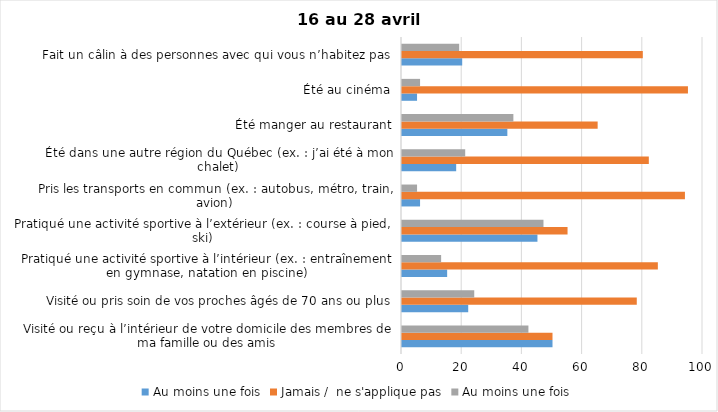
| Category | Au moins une fois | Jamais /  ne s'applique pas |
|---|---|---|
| Visité ou reçu à l’intérieur de votre domicile des membres de ma famille ou des amis | 42 | 50 |
| Visité ou pris soin de vos proches âgés de 70 ans ou plus | 24 | 78 |
| Pratiqué une activité sportive à l’intérieur (ex. : entraînement en gymnase, natation en piscine) | 13 | 85 |
| Pratiqué une activité sportive à l’extérieur (ex. : course à pied, ski) | 47 | 55 |
| Pris les transports en commun (ex. : autobus, métro, train, avion) | 5 | 94 |
| Été dans une autre région du Québec (ex. : j’ai été à mon chalet) | 21 | 82 |
| Été manger au restaurant | 37 | 65 |
| Été au cinéma | 6 | 95 |
| Fait un câlin à des personnes avec qui vous n’habitez pas | 19 | 80 |